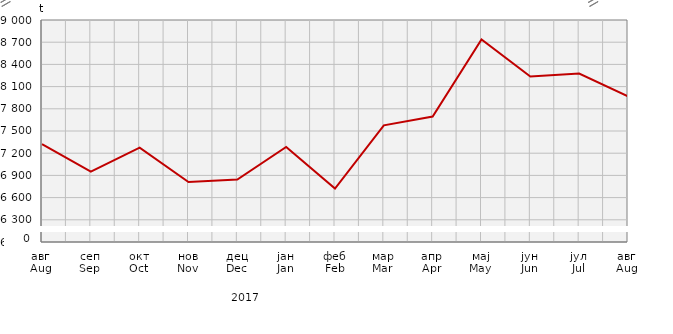
| Category | Прикупљање крављег млијека
Collecting of cow’s milk |
|---|---|
| авг
Aug | 7323 |
| сеп
Sep | 6949.6 |
| окт
Oct | 7275 |
| нов
Nov | 6810.8 |
| дец
Dec | 6844 |
| јан
Jan | 7283.5 |
| феб
Feb | 6721.8 |
| мар
Mar | 7575.8 |
| апр
Apr | 7695.5 |
| мај
May | 8737.947 |
| јун
Jun | 8235.2 |
| јул
Jul | 8277.3 |
| авг
Aug | 7968.1 |